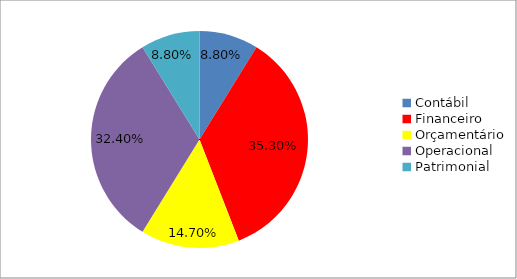
| Category | Series 0 |
|---|---|
| Contábil | 0.088 |
| Financeiro  | 0.353 |
| Orçamentário | 0.147 |
| Operacional | 0.324 |
| Patrimonial | 0.088 |